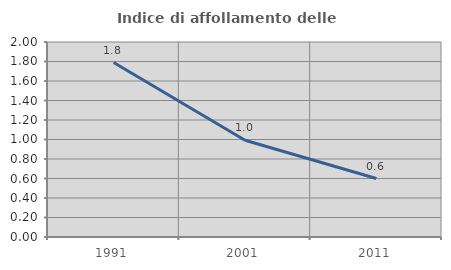
| Category | Indice di affollamento delle abitazioni  |
|---|---|
| 1991.0 | 1.789 |
| 2001.0 | 0.992 |
| 2011.0 | 0.6 |